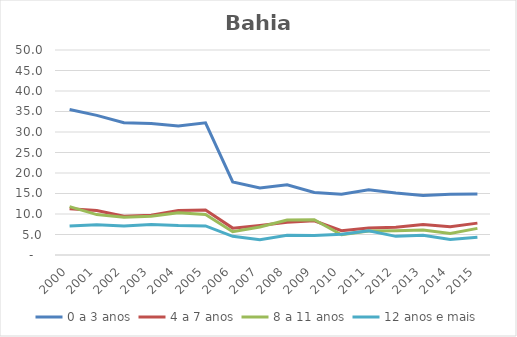
| Category | 0 a 3 anos | 4 a 7 anos | 8 a 11 anos | 12 anos e mais |
|---|---|---|---|---|
| 2000.0 | 35.487 | 11.306 | 11.785 | 7.047 |
| 2001.0 | 34.052 | 10.826 | 9.855 | 7.4 |
| 2002.0 | 32.278 | 9.433 | 9.206 | 7.06 |
| 2003.0 | 32.058 | 9.674 | 9.433 | 7.427 |
| 2004.0 | 31.438 | 10.87 | 10.297 | 7.177 |
| 2005.0 | 32.239 | 10.965 | 9.893 | 7.08 |
| 2006.0 | 17.82 | 6.555 | 5.68 | 4.551 |
| 2007.0 | 16.323 | 7.216 | 6.823 | 3.735 |
| 2008.0 | 17.124 | 7.991 | 8.525 | 4.807 |
| 2009.0 | 15.246 | 8.352 | 8.597 | 4.774 |
| 2010.0 | 14.803 | 5.927 | 4.943 | 5.084 |
| 2011.0 | 15.912 | 6.557 | 5.873 | 5.902 |
| 2012.0 | 15.132 | 6.767 | 5.933 | 4.548 |
| 2013.0 | 14.505 | 7.41 | 6.111 | 4.826 |
| 2014.0 | 14.827 | 6.884 | 5.224 | 3.783 |
| 2015.0 | 14.872 | 7.774 | 6.499 | 4.352 |